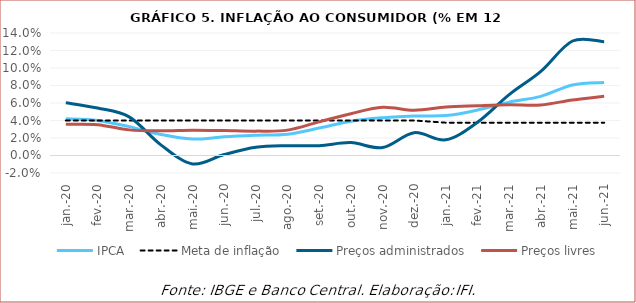
| Category | IPCA | Meta de inflação | Preços administrados | Preços livres |
|---|---|---|---|---|
| 2020-01-01 | 0.042 | 0.04 | 0.06 | 0.036 |
| 2020-02-01 | 0.04 | 0.04 | 0.054 | 0.035 |
| 2020-03-01 | 0.033 | 0.04 | 0.044 | 0.029 |
| 2020-04-01 | 0.024 | 0.04 | 0.012 | 0.028 |
| 2020-05-01 | 0.019 | 0.04 | -0.01 | 0.029 |
| 2020-06-01 | 0.021 | 0.04 | 0.001 | 0.028 |
| 2020-07-01 | 0.023 | 0.04 | 0.009 | 0.028 |
| 2020-08-01 | 0.024 | 0.04 | 0.011 | 0.029 |
| 2020-09-01 | 0.031 | 0.04 | 0.011 | 0.038 |
| 2020-10-01 | 0.039 | 0.04 | 0.015 | 0.048 |
| 2020-11-01 | 0.043 | 0.04 | 0.009 | 0.055 |
| 2020-12-01 | 0.045 | 0.04 | 0.026 | 0.052 |
| 2021-01-01 | 0.046 | 0.038 | 0.018 | 0.055 |
| 2021-02-01 | 0.052 | 0.038 | 0.038 | 0.057 |
| 2021-03-01 | 0.061 | 0.038 | 0.07 | 0.058 |
| 2021-04-01 | 0.068 | 0.038 | 0.096 | 0.058 |
| 2021-05-01 | 0.081 | 0.038 | 0.131 | 0.063 |
| 2021-06-01 | 0.083 | 0.038 | 0.13 | 0.068 |